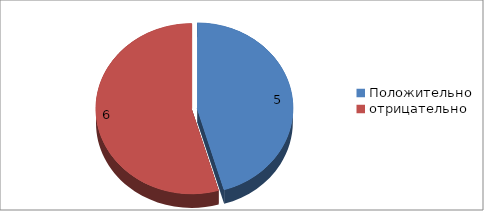
| Category | Series 0 |
|---|---|
| Положительно | 5 |
| отрицательно | 6 |